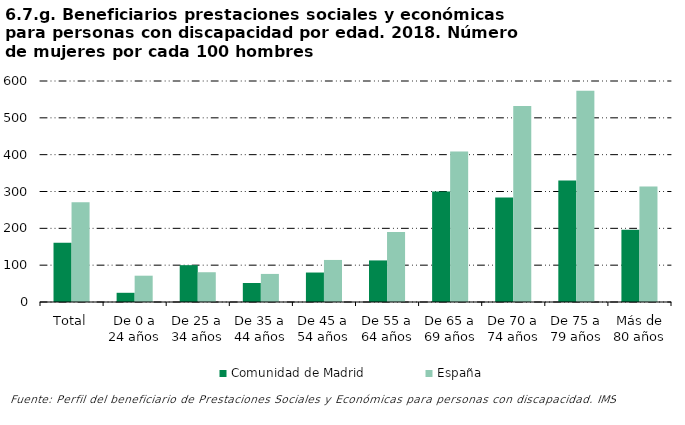
| Category | Comunidad de Madrid | España |
|---|---|---|
| Total | 161.149 | 270.599 |
| De 0 a 24 años | 25 | 71.429 |
| De 25 a 34 años | 100 | 80.795 |
| De 35 a 44 años | 51.515 | 76.238 |
| De 45 a 54 años | 80 | 114.181 |
| De 55 a 64 años | 112.871 | 189.922 |
| De 65 a 69 años | 300 | 408.602 |
| De 70 a 74 años | 283.871 | 531.892 |
| De 75 a 79 años | 329.63 | 573.797 |
| Más de 80 años | 195.868 | 313.384 |